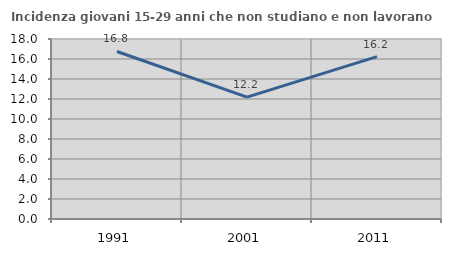
| Category | Incidenza giovani 15-29 anni che non studiano e non lavorano  |
|---|---|
| 1991.0 | 16.753 |
| 2001.0 | 12.187 |
| 2011.0 | 16.239 |